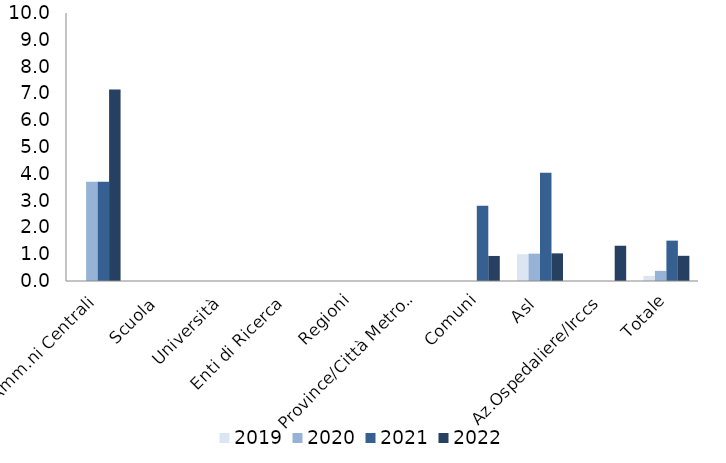
| Category | 2019 | 2020 | 2021 | 2022 |
|---|---|---|---|---|
| Amm.ni Centrali | 0 | 3.704 | 3.704 | 7.143 |
| Scuola | 0 | 0 | 0 | 0 |
| Università | 0 | 0 | 0 | 0 |
| Enti di Ricerca | 0 | 0 | 0 | 0 |
| Regioni | 0 | 0 | 0 | 0 |
| Province/Città Metrop. | 0 | 0 | 0 | 0 |
| Comuni | 0 | 0 | 2.804 | 0.935 |
| Asl | 1 | 1.02 | 4.04 | 1.031 |
| Az.Ospedaliere/Irccs | 0 | 0 | 0 | 1.316 |
| Totale | 0.191 | 0.378 | 1.507 | 0.94 |